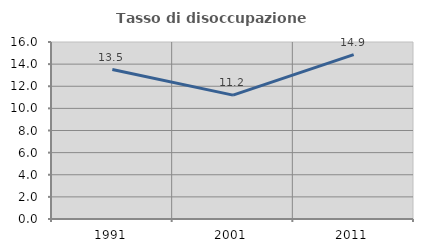
| Category | Tasso di disoccupazione giovanile  |
|---|---|
| 1991.0 | 13.514 |
| 2001.0 | 11.2 |
| 2011.0 | 14.865 |